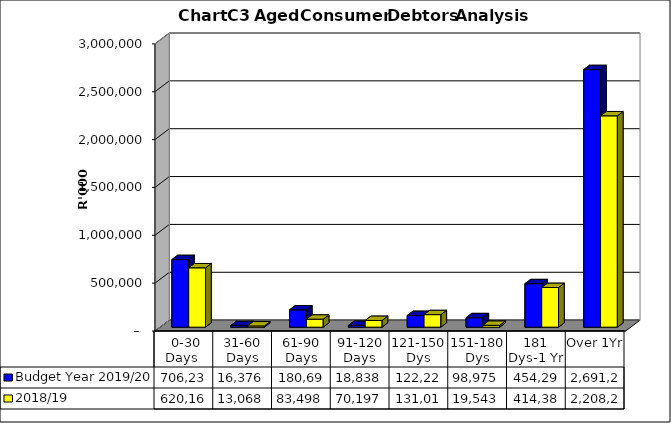
| Category | Budget Year 2019/20 | 2018/19 |
|---|---|---|
|  0-30 Days  | 706236012.39 | 620166130 |
| 31-60 Days | 16375525.92 | 13068120 |
| 61-90 Days | 180699068.26 | 83497768 |
| 91-120 Days | 18837669.8 | 70197107 |
| 121-150 Dys | 122221189.28 | 131018947 |
| 151-180 Dys | 98975212.93 | 19543355 |
| 181 Dys-1 Yr | 454294899.35 | 414385957 |
| Over 1Yr | 2691237135.48 | 2208223072 |